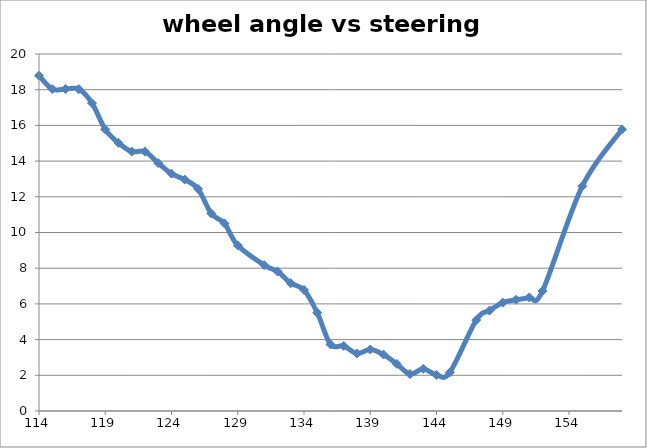
| Category | angle |
|---|---|
| 158.0 | 15.777 |
| 155.0 | 12.595 |
| 152.0 | 6.723 |
| 151.0 | 6.361 |
| 150.0 | 6.232 |
| 149.0 | 6.072 |
| 148.0 | 5.627 |
| 147.0 | 5.094 |
| 145.0 | 2.158 |
| 144.0 | 2.021 |
| 143.0 | 2.36 |
| 142.0 | 2.069 |
| 141.0 | 2.639 |
| 140.0 | 3.163 |
| 139.0 | 3.446 |
| 138.0 | 3.221 |
| 137.0 | 3.642 |
| 136.0 | 3.73 |
| 135.0 | 5.506 |
| 134.0 | 6.782 |
| 133.0 | 7.162 |
| 132.0 | 7.816 |
| 131.0 | 8.169 |
| 129.0 | 9.275 |
| 128.0 | 10.504 |
| 127.0 | 11.068 |
| 126.0 | 12.444 |
| 125.0 | 12.962 |
| 124.0 | 13.294 |
| 123.0 | 13.886 |
| 122.0 | 14.533 |
| 121.0 | 14.533 |
| 120.0 | 15.021 |
| 119.0 | 15.777 |
| 118.0 | 17.248 |
| 117.0 | 18.036 |
| 116.0 | 18.036 |
| 115.0 | 18.036 |
| 114.0 | 18.785 |